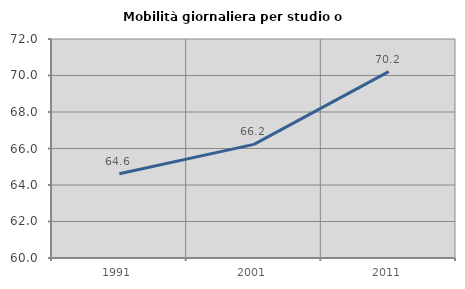
| Category | Mobilità giornaliera per studio o lavoro |
|---|---|
| 1991.0 | 64.618 |
| 2001.0 | 66.226 |
| 2011.0 | 70.211 |